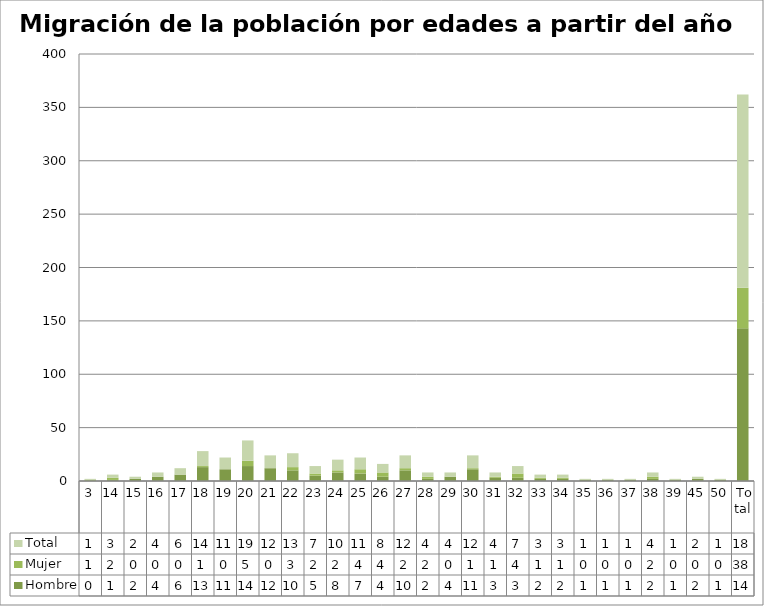
| Category | Hombre | Mujer | Total |
|---|---|---|---|
| 3 | 0 | 1 | 1 |
| 14 | 1 | 2 | 3 |
| 15 | 2 | 0 | 2 |
| 16 | 4 | 0 | 4 |
| 17 | 6 | 0 | 6 |
| 18 | 13 | 1 | 14 |
| 19 | 11 | 0 | 11 |
| 20 | 14 | 5 | 19 |
| 21 | 12 | 0 | 12 |
| 22 | 10 | 3 | 13 |
| 23 | 5 | 2 | 7 |
| 24 | 8 | 2 | 10 |
| 25 | 7 | 4 | 11 |
| 26 | 4 | 4 | 8 |
| 27 | 10 | 2 | 12 |
| 28 | 2 | 2 | 4 |
| 29 | 4 | 0 | 4 |
| 30 | 11 | 1 | 12 |
| 31 | 3 | 1 | 4 |
| 32 | 3 | 4 | 7 |
| 33 | 2 | 1 | 3 |
| 34 | 2 | 1 | 3 |
| 35 | 1 | 0 | 1 |
| 36 | 1 | 0 | 1 |
| 37 | 1 | 0 | 1 |
| 38 | 2 | 2 | 4 |
| 39 | 1 | 0 | 1 |
| 45 | 2 | 0 | 2 |
| 50 | 1 | 0 | 1 |
|  Total | 143 | 38 | 181 |